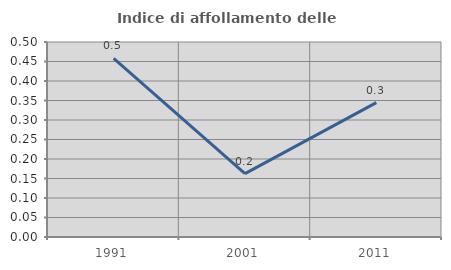
| Category | Indice di affollamento delle abitazioni  |
|---|---|
| 1991.0 | 0.458 |
| 2001.0 | 0.162 |
| 2011.0 | 0.345 |